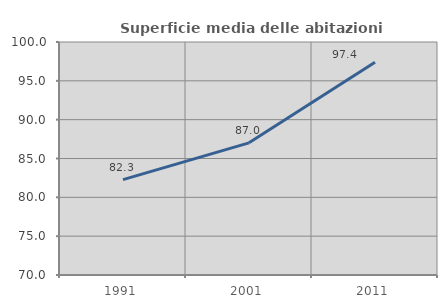
| Category | Superficie media delle abitazioni occupate |
|---|---|
| 1991.0 | 82.279 |
| 2001.0 | 87.015 |
| 2011.0 | 97.383 |